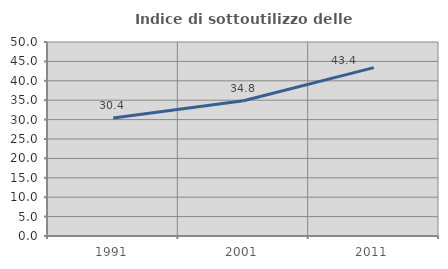
| Category | Indice di sottoutilizzo delle abitazioni  |
|---|---|
| 1991.0 | 30.411 |
| 2001.0 | 34.841 |
| 2011.0 | 43.404 |